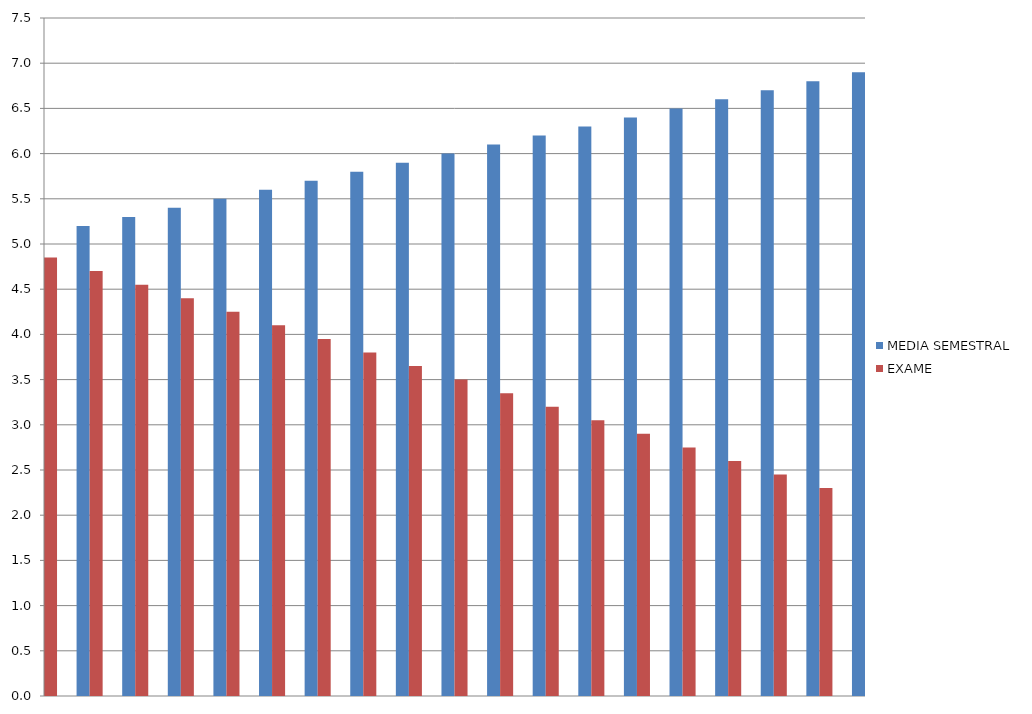
| Category | MEDIA SEMESTRAL | EXAME |
|---|---|---|
| 0 | 5.1 | 4.85 |
| 1 | 5.2 | 4.7 |
| 2 | 5.3 | 4.55 |
| 3 | 5.4 | 4.4 |
| 4 | 5.5 | 4.25 |
| 5 | 5.6 | 4.1 |
| 6 | 5.7 | 3.95 |
| 7 | 5.8 | 3.8 |
| 8 | 5.9 | 3.65 |
| 9 | 6 | 3.5 |
| 10 | 6.1 | 3.35 |
| 11 | 6.2 | 3.2 |
| 12 | 6.3 | 3.05 |
| 13 | 6.4 | 2.9 |
| 14 | 6.5 | 2.75 |
| 15 | 6.6 | 2.6 |
| 16 | 6.7 | 2.45 |
| 17 | 6.8 | 2.3 |
| 18 | 6.9 | 2.15 |